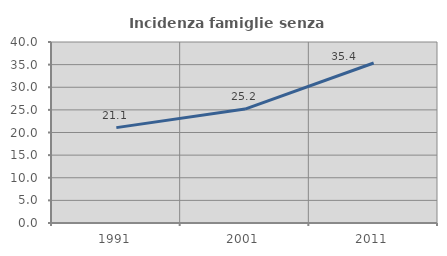
| Category | Incidenza famiglie senza nuclei |
|---|---|
| 1991.0 | 21.081 |
| 2001.0 | 25.179 |
| 2011.0 | 35.352 |